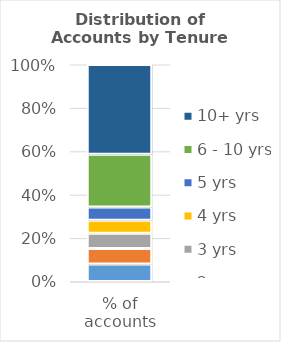
| Category | 1 yr | 2 yrs | 3 yrs | 4 yrs | 5 yrs | 6 - 10 yrs | 10+ yrs |
|---|---|---|---|---|---|---|---|
| % of accounts | 8 | 7 | 7 | 6 | 6 | 24 | 41 |